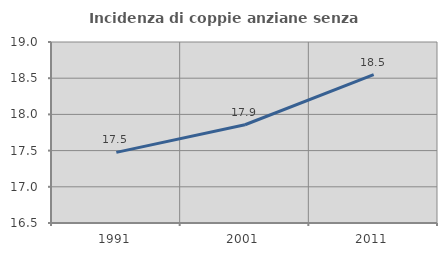
| Category | Incidenza di coppie anziane senza figli  |
|---|---|
| 1991.0 | 17.476 |
| 2001.0 | 17.857 |
| 2011.0 | 18.548 |